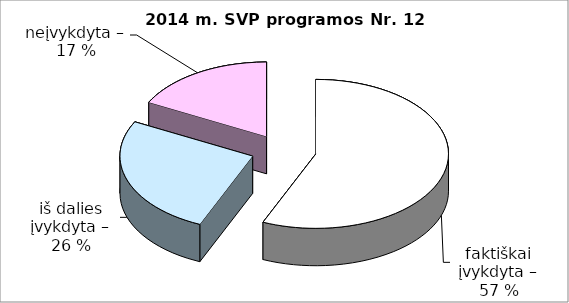
| Category | Series 0 |
|---|---|
| faktiškai įvykdyta – | 13 |
| iš dalies įvykdyta – | 6 |
| neįvykdyta | 4 |